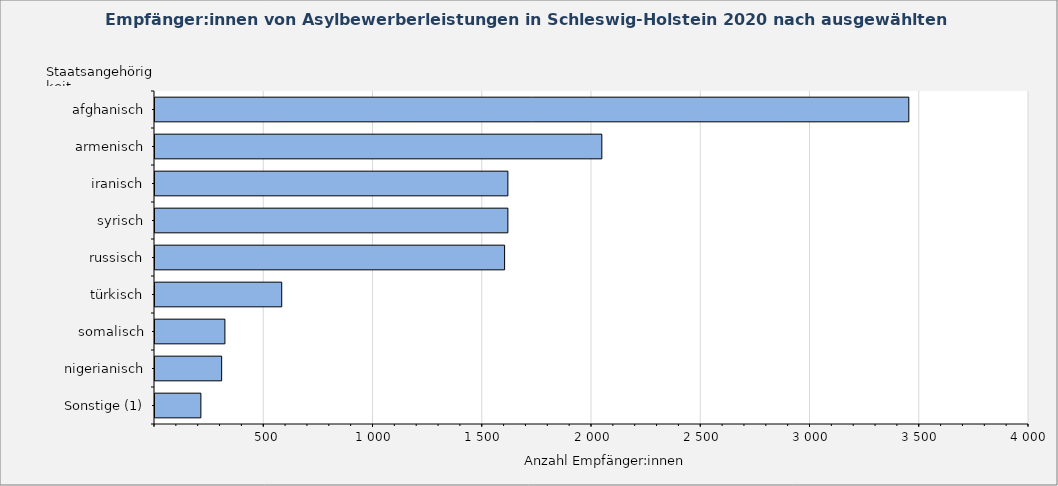
| Category | Anzahl Empfänger:innen |
|---|---|
| afghanisch | 3450 |
| armenisch | 2045 |
| iranisch | 1615 |
| syrisch | 1615 |
| russisch | 1600 |
| türkisch | 580 |
| somalisch | 320 |
| nigerianisch | 305 |
| Sonstige (1) | 210 |